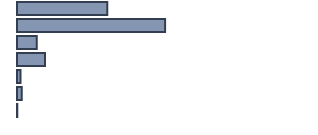
| Category | Series 0 |
|---|---|
| 0 | 30.6 |
| 1 | 50.2 |
| 2 | 6.7 |
| 3 | 9.5 |
| 4 | 1.2 |
| 5 | 1.6 |
| 6 | 0.1 |